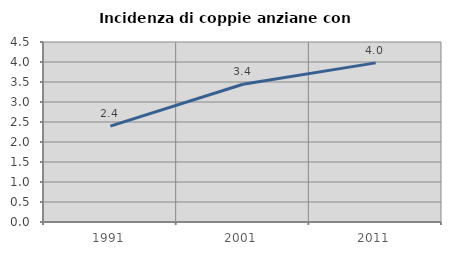
| Category | Incidenza di coppie anziane con figli |
|---|---|
| 1991.0 | 2.396 |
| 2001.0 | 3.445 |
| 2011.0 | 3.978 |